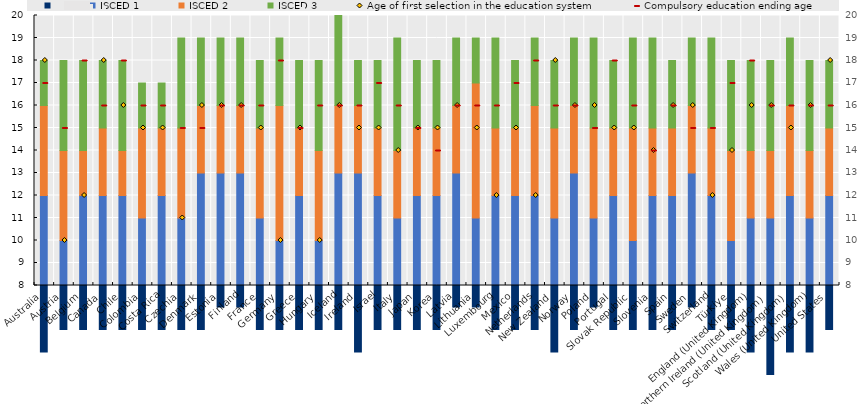
| Category | Series 7 | ISCED 1 | ISCED 2 | ISCED 3 |
|---|---|---|---|---|
| Australia     | 5 | 7 | 4 | 2 |
| Austria     | 6 | 4 | 4 | 4 |
| Belgium     | 6 | 6 | 2 | 4 |
| Canada     | 6 | 6 | 3 | 3 |
| Chile     | 6 | 6 | 2 | 4 |
| Colombia     | 6 | 5 | 4 | 2 |
| Costa Rica     | 6 | 6 | 3 | 2 |
| Czechia     | 6 | 5 | 4 | 4 |
| Denmark     | 6 | 7 | 3 | 3 |
| Estonia     | 7 | 6 | 3 | 3 |
| Finland     | 7 | 6 | 3 | 3 |
| France     | 6 | 5 | 4 | 3 |
| Germany     | 6 | 4 | 6 | 3 |
| Greece     | 6 | 6 | 3 | 3 |
| Hungary     | 6 | 4 | 4 | 4 |
| Iceland     | 6 | 7 | 3 | 4 |
| Ireland     | 5 | 8 | 3 | 2 |
| Israel     | 6 | 6 | 3 | 3 |
| Italy     | 6 | 5 | 3 | 5 |
| Japan     | 6 | 6 | 3 | 3 |
| Korea     | 6 | 6 | 3 | 3 |
| Latvia     | 7 | 6 | 3 | 3 |
| Lithuania     | 7 | 4 | 6 | 2 |
| Luxembourg     | 6 | 6 | 3 | 4 |
| Mexico     | 6 | 6 | 3 | 3 |
| Netherlands     | 6 | 6 | 4 | 3 |
| New Zealand     | 5 | 6 | 4 | 3 |
| Norway     | 6 | 7 | 3 | 3 |
| Poland     | 7 | 4 | 4 | 4 |
| Portugal     | 6 | 6 | 3 | 3 |
| Slovak Republic     | 6 | 4 | 5 | 4 |
| Slovenia     | 6 | 6 | 3 | 4 |
| Spain     | 6 | 6 | 3 | 3 |
| Sweden     | 7 | 6 | 3 | 3 |
| Switzerland     | 6 | 6 | 3 | 4 |
| Türkiye     | 6 | 4 | 4 | 4 |
| England (United Kingdom)     | 5 | 6 | 3 | 4 |
| Northern Ireland (United Kingdom)     | 4 | 7 | 3 | 4 |
| Scotland (United Kingdom)     | 5 | 7 | 4 | 3 |
| Wales (United Kingdom)     | 5 | 6 | 3 | 4 |
| United States     | 6 | 6 | 3 | 3 |